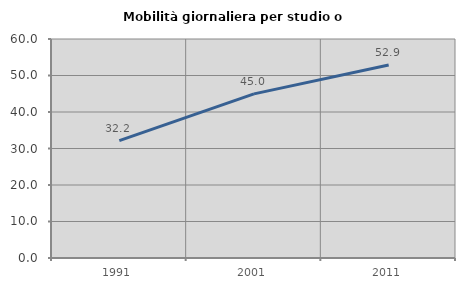
| Category | Mobilità giornaliera per studio o lavoro |
|---|---|
| 1991.0 | 32.156 |
| 2001.0 | 44.974 |
| 2011.0 | 52.865 |